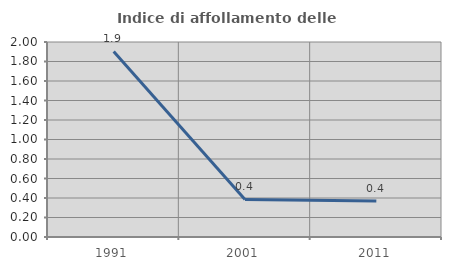
| Category | Indice di affollamento delle abitazioni  |
|---|---|
| 1991.0 | 1.903 |
| 2001.0 | 0.385 |
| 2011.0 | 0.368 |